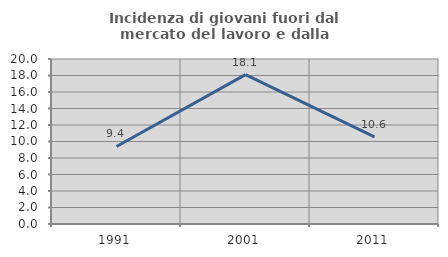
| Category | Incidenza di giovani fuori dal mercato del lavoro e dalla formazione  |
|---|---|
| 1991.0 | 9.395 |
| 2001.0 | 18.1 |
| 2011.0 | 10.562 |